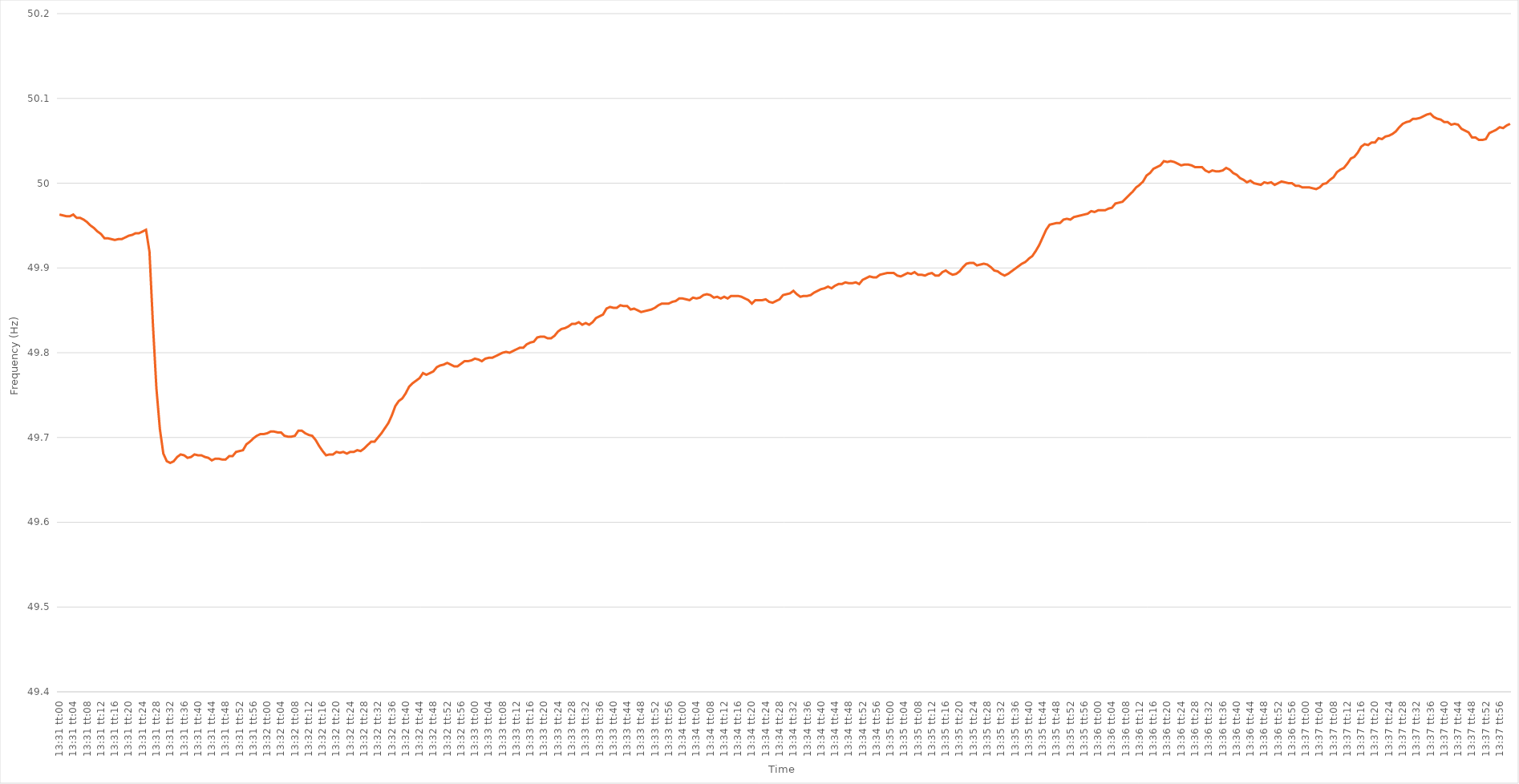
| Category | Series 0 |
|---|---|
| 0.5631944444444444 | 49.963 |
| 0.5632060185185185 | 49.962 |
| 0.5632175925925926 | 49.961 |
| 0.5632291666666667 | 49.961 |
| 0.5632407407407407 | 49.963 |
| 0.5632523148148149 | 49.959 |
| 0.5632638888888889 | 49.959 |
| 0.5632754629629629 | 49.957 |
| 0.563287037037037 | 49.954 |
| 0.5632986111111111 | 49.95 |
| 0.5633101851851852 | 49.947 |
| 0.5633217592592593 | 49.943 |
| 0.5633333333333334 | 49.94 |
| 0.5633449074074074 | 49.935 |
| 0.5633564814814814 | 49.935 |
| 0.5633680555555556 | 49.934 |
| 0.5633796296296296 | 49.933 |
| 0.5633912037037038 | 49.934 |
| 0.5634027777777778 | 49.934 |
| 0.5634143518518518 | 49.936 |
| 0.5634259259259259 | 49.938 |
| 0.5634375 | 49.939 |
| 0.5634490740740741 | 49.941 |
| 0.5634606481481481 | 49.941 |
| 0.5634722222222223 | 49.943 |
| 0.5634837962962963 | 49.945 |
| 0.5634953703703703 | 49.919 |
| 0.5635069444444444 | 49.833 |
| 0.5635185185185185 | 49.758 |
| 0.5635300925925926 | 49.71 |
| 0.5635416666666667 | 49.681 |
| 0.5635532407407408 | 49.672 |
| 0.5635648148148148 | 49.67 |
| 0.5635763888888888 | 49.672 |
| 0.563587962962963 | 49.677 |
| 0.563599537037037 | 49.68 |
| 0.5636111111111112 | 49.679 |
| 0.5636226851851852 | 49.676 |
| 0.5636342592592593 | 49.677 |
| 0.5636458333333333 | 49.68 |
| 0.5636574074074074 | 49.679 |
| 0.5636689814814815 | 49.679 |
| 0.5636805555555555 | 49.677 |
| 0.5636921296296297 | 49.676 |
| 0.5637037037037037 | 49.673 |
| 0.5637152777777777 | 49.675 |
| 0.5637268518518518 | 49.675 |
| 0.5637384259259259 | 49.674 |
| 0.56375 | 49.674 |
| 0.5637615740740741 | 49.678 |
| 0.5637731481481482 | 49.678 |
| 0.5637847222222222 | 49.683 |
| 0.5637962962962962 | 49.684 |
| 0.5638078703703704 | 49.685 |
| 0.5638194444444444 | 49.692 |
| 0.5638310185185186 | 49.695 |
| 0.5638425925925926 | 49.699 |
| 0.5638541666666667 | 49.702 |
| 0.5638657407407407 | 49.704 |
| 0.5638773148148148 | 49.704 |
| 0.5638888888888889 | 49.705 |
| 0.563900462962963 | 49.707 |
| 0.5639120370370371 | 49.707 |
| 0.5639236111111111 | 49.706 |
| 0.5639351851851852 | 49.706 |
| 0.5639467592592592 | 49.702 |
| 0.5639583333333333 | 49.701 |
| 0.5639699074074074 | 49.701 |
| 0.5639814814814815 | 49.702 |
| 0.5639930555555556 | 49.708 |
| 0.5640046296296296 | 49.708 |
| 0.5640162037037036 | 49.705 |
| 0.5640277777777778 | 49.703 |
| 0.5640393518518518 | 49.702 |
| 0.564050925925926 | 49.697 |
| 0.5640625 | 49.69 |
| 0.5640740740740741 | 49.684 |
| 0.5640856481481481 | 49.679 |
| 0.5640972222222222 | 49.68 |
| 0.5641087962962963 | 49.68 |
| 0.5641203703703704 | 49.683 |
| 0.5641319444444445 | 49.682 |
| 0.5641435185185185 | 49.683 |
| 0.5641550925925926 | 49.681 |
| 0.5641666666666666 | 49.683 |
| 0.5641782407407407 | 49.683 |
| 0.5641898148148148 | 49.685 |
| 0.5642013888888889 | 49.684 |
| 0.564212962962963 | 49.687 |
| 0.564224537037037 | 49.691 |
| 0.564236111111111 | 49.695 |
| 0.5642476851851852 | 49.695 |
| 0.5642592592592592 | 49.7 |
| 0.5642708333333334 | 49.705 |
| 0.5642824074074074 | 49.711 |
| 0.5642939814814815 | 49.717 |
| 0.5643055555555555 | 49.726 |
| 0.5643171296296297 | 49.737 |
| 0.5643287037037037 | 49.743 |
| 0.5643402777777778 | 49.746 |
| 0.5643518518518519 | 49.752 |
| 0.5643634259259259 | 49.76 |
| 0.564375 | 49.764 |
| 0.5643865740740741 | 49.767 |
| 0.5643981481481481 | 49.77 |
| 0.5644097222222222 | 49.776 |
| 0.5644212962962963 | 49.774 |
| 0.5644328703703704 | 49.776 |
| 0.5644444444444444 | 49.778 |
| 0.5644560185185185 | 49.783 |
| 0.5644675925925926 | 49.785 |
| 0.5644791666666666 | 49.786 |
| 0.5644907407407408 | 49.788 |
| 0.5645023148148148 | 49.786 |
| 0.5645138888888889 | 49.784 |
| 0.5645254629629629 | 49.784 |
| 0.5645370370370371 | 49.787 |
| 0.5645486111111111 | 49.79 |
| 0.5645601851851852 | 49.79 |
| 0.5645717592592593 | 49.791 |
| 0.5645833333333333 | 49.793 |
| 0.5645949074074074 | 49.792 |
| 0.5646064814814815 | 49.79 |
| 0.5646180555555556 | 49.793 |
| 0.5646296296296297 | 49.794 |
| 0.5646412037037037 | 49.794 |
| 0.5646527777777778 | 49.796 |
| 0.5646643518518518 | 49.798 |
| 0.5646759259259259 | 49.8 |
| 0.5646875 | 49.801 |
| 0.564699074074074 | 49.8 |
| 0.5647106481481482 | 49.802 |
| 0.5647222222222222 | 49.804 |
| 0.5647337962962963 | 49.806 |
| 0.5647453703703703 | 49.806 |
| 0.5647569444444445 | 49.81 |
| 0.5647685185185185 | 49.812 |
| 0.5647800925925927 | 49.813 |
| 0.5647916666666667 | 49.818 |
| 0.5648032407407407 | 49.819 |
| 0.5648148148148148 | 49.819 |
| 0.5648263888888889 | 49.817 |
| 0.564837962962963 | 49.817 |
| 0.5648495370370371 | 49.82 |
| 0.5648611111111111 | 49.825 |
| 0.5648726851851852 | 49.828 |
| 0.5648842592592592 | 49.829 |
| 0.5648958333333333 | 49.831 |
| 0.5649074074074074 | 49.834 |
| 0.5649189814814815 | 49.834 |
| 0.5649305555555556 | 49.836 |
| 0.5649421296296296 | 49.833 |
| 0.5649537037037037 | 49.835 |
| 0.5649652777777777 | 49.833 |
| 0.5649768518518519 | 49.836 |
| 0.5649884259259259 | 49.841 |
| 0.5650000000000001 | 49.843 |
| 0.5650115740740741 | 49.845 |
| 0.5650231481481481 | 49.852 |
| 0.5650347222222222 | 49.854 |
| 0.5650462962962963 | 49.853 |
| 0.5650578703703704 | 49.853 |
| 0.5650694444444445 | 49.856 |
| 0.5650810185185186 | 49.855 |
| 0.5650925925925926 | 49.855 |
| 0.5651041666666666 | 49.851 |
| 0.5651157407407407 | 49.852 |
| 0.5651273148148148 | 49.85 |
| 0.5651388888888889 | 49.848 |
| 0.565150462962963 | 49.849 |
| 0.565162037037037 | 49.85 |
| 0.5651736111111111 | 49.851 |
| 0.5651851851851851 | 49.853 |
| 0.5651967592592593 | 49.856 |
| 0.5652083333333333 | 49.858 |
| 0.5652199074074075 | 49.858 |
| 0.5652314814814815 | 49.858 |
| 0.5652430555555555 | 49.86 |
| 0.5652546296296296 | 49.861 |
| 0.5652662037037037 | 49.864 |
| 0.5652777777777778 | 49.864 |
| 0.5652893518518519 | 49.863 |
| 0.565300925925926 | 49.862 |
| 0.5653125 | 49.865 |
| 0.565324074074074 | 49.864 |
| 0.5653356481481482 | 49.865 |
| 0.5653472222222222 | 49.868 |
| 0.5653587962962963 | 49.869 |
| 0.5653703703703704 | 49.868 |
| 0.5653819444444445 | 49.865 |
| 0.5653935185185185 | 49.866 |
| 0.5654050925925925 | 49.864 |
| 0.5654166666666667 | 49.866 |
| 0.5654282407407407 | 49.864 |
| 0.5654398148148149 | 49.867 |
| 0.5654513888888889 | 49.867 |
| 0.565462962962963 | 49.867 |
| 0.565474537037037 | 49.866 |
| 0.5654861111111111 | 49.864 |
| 0.5654976851851852 | 49.862 |
| 0.5655092592592593 | 49.858 |
| 0.5655208333333334 | 49.862 |
| 0.5655324074074074 | 49.862 |
| 0.5655439814814814 | 49.862 |
| 0.5655555555555556 | 49.863 |
| 0.5655671296296296 | 49.86 |
| 0.5655787037037037 | 49.859 |
| 0.5655902777777778 | 49.861 |
| 0.5656018518518519 | 49.863 |
| 0.5656134259259259 | 49.868 |
| 0.5656249999999999 | 49.869 |
| 0.5656365740740741 | 49.87 |
| 0.5656481481481481 | 49.873 |
| 0.5656597222222223 | 49.869 |
| 0.5656712962962963 | 49.866 |
| 0.5656828703703703 | 49.867 |
| 0.5656944444444444 | 49.867 |
| 0.5657060185185185 | 49.868 |
| 0.5657175925925926 | 49.871 |
| 0.5657291666666667 | 49.873 |
| 0.5657407407407408 | 49.875 |
| 0.5657523148148148 | 49.876 |
| 0.5657638888888888 | 49.878 |
| 0.565775462962963 | 49.876 |
| 0.565787037037037 | 49.879 |
| 0.5657986111111112 | 49.881 |
| 0.5658101851851852 | 49.881 |
| 0.5658217592592593 | 49.883 |
| 0.5658333333333333 | 49.882 |
| 0.5658449074074073 | 49.882 |
| 0.5658564814814815 | 49.883 |
| 0.5658680555555555 | 49.881 |
| 0.5658796296296297 | 49.886 |
| 0.5658912037037037 | 49.888 |
| 0.5659027777777778 | 49.89 |
| 0.5659143518518518 | 49.889 |
| 0.5659259259259259 | 49.889 |
| 0.5659375 | 49.892 |
| 0.5659490740740741 | 49.893 |
| 0.5659606481481482 | 49.894 |
| 0.5659722222222222 | 49.894 |
| 0.5659837962962962 | 49.894 |
| 0.5659953703703704 | 49.891 |
| 0.5660069444444444 | 49.89 |
| 0.5660185185185186 | 49.892 |
| 0.5660300925925926 | 49.894 |
| 0.5660416666666667 | 49.893 |
| 0.5660532407407407 | 49.895 |
| 0.5660648148148147 | 49.892 |
| 0.5660763888888889 | 49.892 |
| 0.5660879629629629 | 49.891 |
| 0.5660995370370371 | 49.893 |
| 0.5661111111111111 | 49.894 |
| 0.5661226851851852 | 49.891 |
| 0.5661342592592592 | 49.891 |
| 0.5661458333333333 | 49.895 |
| 0.5661574074074074 | 49.897 |
| 0.5661689814814815 | 49.894 |
| 0.5661805555555556 | 49.892 |
| 0.5661921296296296 | 49.893 |
| 0.5662037037037037 | 49.896 |
| 0.5662152777777778 | 49.901 |
| 0.5662268518518518 | 49.905 |
| 0.566238425925926 | 49.906 |
| 0.56625 | 49.906 |
| 0.5662615740740741 | 49.903 |
| 0.5662731481481481 | 49.904 |
| 0.5662847222222223 | 49.905 |
| 0.5662962962962963 | 49.904 |
| 0.5663078703703703 | 49.901 |
| 0.5663194444444445 | 49.897 |
| 0.5663310185185185 | 49.896 |
| 0.5663425925925926 | 49.893 |
| 0.5663541666666666 | 49.891 |
| 0.5663657407407408 | 49.893 |
| 0.5663773148148148 | 49.896 |
| 0.5663888888888889 | 49.899 |
| 0.566400462962963 | 49.902 |
| 0.566412037037037 | 49.905 |
| 0.5664236111111111 | 49.907 |
| 0.5664351851851852 | 49.911 |
| 0.5664467592592592 | 49.914 |
| 0.5664583333333334 | 49.92 |
| 0.5664699074074074 | 49.927 |
| 0.5664814814814815 | 49.936 |
| 0.5664930555555555 | 49.945 |
| 0.5665046296296297 | 49.951 |
| 0.5665162037037037 | 49.952 |
| 0.5665277777777777 | 49.953 |
| 0.5665393518518519 | 49.953 |
| 0.5665509259259259 | 49.957 |
| 0.5665625 | 49.958 |
| 0.566574074074074 | 49.957 |
| 0.5665856481481482 | 49.96 |
| 0.5665972222222222 | 49.961 |
| 0.5666087962962963 | 49.962 |
| 0.5666203703703704 | 49.963 |
| 0.5666319444444444 | 49.964 |
| 0.5666435185185185 | 49.967 |
| 0.5666550925925926 | 49.966 |
| 0.5666666666666667 | 49.968 |
| 0.5666782407407408 | 49.968 |
| 0.5666898148148148 | 49.968 |
| 0.5667013888888889 | 49.97 |
| 0.5667129629629629 | 49.971 |
| 0.5667245370370371 | 49.976 |
| 0.5667361111111111 | 49.977 |
| 0.5667476851851853 | 49.978 |
| 0.5667592592592593 | 49.982 |
| 0.5667708333333333 | 49.986 |
| 0.5667824074074074 | 49.99 |
| 0.5667939814814814 | 49.995 |
| 0.5668055555555556 | 49.998 |
| 0.5668171296296296 | 50.002 |
| 0.5668287037037038 | 50.009 |
| 0.5668402777777778 | 50.012 |
| 0.5668518518518518 | 50.017 |
| 0.5668634259259259 | 50.019 |
| 0.566875 | 50.021 |
| 0.5668865740740741 | 50.026 |
| 0.5668981481481482 | 50.025 |
| 0.5669097222222222 | 50.026 |
| 0.5669212962962963 | 50.025 |
| 0.5669328703703703 | 50.023 |
| 0.5669444444444445 | 50.021 |
| 0.5669560185185185 | 50.022 |
| 0.5669675925925927 | 50.022 |
| 0.5669791666666667 | 50.021 |
| 0.5669907407407407 | 50.019 |
| 0.5670023148148148 | 50.019 |
| 0.5670138888888888 | 50.019 |
| 0.567025462962963 | 50.015 |
| 0.567037037037037 | 50.013 |
| 0.5670486111111112 | 50.015 |
| 0.5670601851851852 | 50.014 |
| 0.5670717592592592 | 50.014 |
| 0.5670833333333333 | 50.015 |
| 0.5670949074074074 | 50.018 |
| 0.5671064814814815 | 50.016 |
| 0.5671180555555556 | 50.012 |
| 0.5671296296296297 | 50.01 |
| 0.5671412037037037 | 50.006 |
| 0.5671527777777777 | 50.004 |
| 0.5671643518518519 | 50.001 |
| 0.5671759259259259 | 50.003 |
| 0.5671875000000001 | 50 |
| 0.5671990740740741 | 49.999 |
| 0.5672106481481481 | 49.998 |
| 0.5672222222222222 | 50.001 |
| 0.5672337962962963 | 50 |
| 0.5672453703703704 | 50.001 |
| 0.5672569444444444 | 49.998 |
| 0.5672685185185186 | 50 |
| 0.5672800925925926 | 50.002 |
| 0.5672916666666666 | 50.001 |
| 0.5673032407407407 | 50 |
| 0.5673148148148148 | 50 |
| 0.5673263888888889 | 49.997 |
| 0.567337962962963 | 49.997 |
| 0.567349537037037 | 49.995 |
| 0.5673611111111111 | 49.995 |
| 0.5673726851851851 | 49.995 |
| 0.5673842592592593 | 49.994 |
| 0.5673958333333333 | 49.993 |
| 0.5674074074074075 | 49.995 |
| 0.5674189814814815 | 49.999 |
| 0.5674305555555555 | 50 |
| 0.5674421296296296 | 50.004 |
| 0.5674537037037037 | 50.007 |
| 0.5674652777777778 | 50.013 |
| 0.5674768518518518 | 50.016 |
| 0.567488425925926 | 50.018 |
| 0.5675 | 50.023 |
| 0.567511574074074 | 50.029 |
| 0.5675231481481481 | 50.031 |
| 0.5675347222222222 | 50.036 |
| 0.5675462962962963 | 50.043 |
| 0.5675578703703704 | 50.046 |
| 0.5675694444444445 | 50.045 |
| 0.5675810185185185 | 50.048 |
| 0.5675925925925925 | 50.048 |
| 0.5676041666666667 | 50.053 |
| 0.5676157407407407 | 50.052 |
| 0.5676273148148149 | 50.055 |
| 0.5676388888888889 | 50.056 |
| 0.567650462962963 | 50.058 |
| 0.567662037037037 | 50.061 |
| 0.5676736111111111 | 50.066 |
| 0.5676851851851852 | 50.07 |
| 0.5676967592592593 | 50.072 |
| 0.5677083333333334 | 50.073 |
| 0.5677199074074074 | 50.076 |
| 0.5677314814814814 | 50.076 |
| 0.5677430555555555 | 50.077 |
| 0.5677546296296296 | 50.079 |
| 0.5677662037037037 | 50.081 |
| 0.5677777777777778 | 50.082 |
| 0.5677893518518519 | 50.078 |
| 0.5678009259259259 | 50.076 |
| 0.5678124999999999 | 50.075 |
| 0.5678240740740741 | 50.072 |
| 0.5678356481481481 | 50.072 |
| 0.5678472222222223 | 50.069 |
| 0.5678587962962963 | 50.07 |
| 0.5678703703703704 | 50.069 |
| 0.5678819444444444 | 50.064 |
| 0.5678935185185185 | 50.062 |
| 0.5679050925925926 | 50.06 |
| 0.5679166666666667 | 50.054 |
| 0.5679282407407408 | 50.054 |
| 0.5679398148148148 | 50.051 |
| 0.5679513888888889 | 50.051 |
| 0.5679629629629629 | 50.052 |
| 0.567974537037037 | 50.059 |
| 0.5679861111111111 | 50.061 |
| 0.5679976851851852 | 50.063 |
| 0.5680092592592593 | 50.066 |
| 0.5680208333333333 | 50.065 |
| 0.5680324074074073 | 50.068 |
| 0.5680439814814815 | 50.07 |